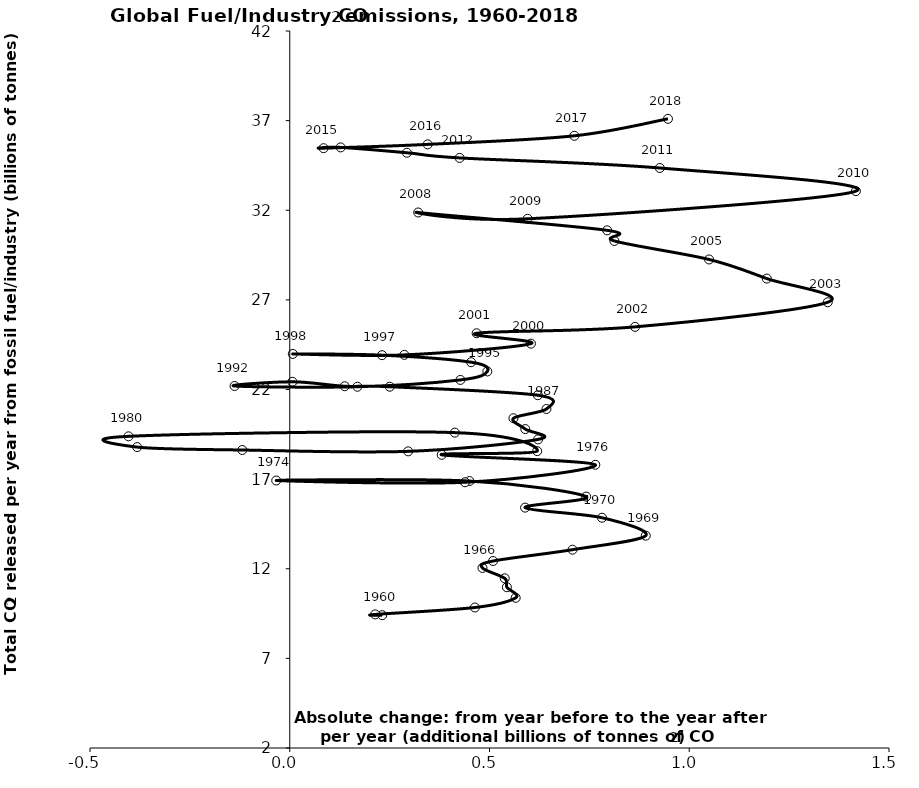
| Category | Series 0 |
|---|---|
| 0.23146562407475813 | 9.411 |
| 0.21383615006685286 | 9.452 |
| 0.4634801109361941 | 9.838 |
| 0.5655615440926338 | 10.379 |
| 0.5435411324445001 | 10.969 |
| 0.5381153633824161 | 11.466 |
| 0.4824295769018647 | 12.046 |
| 0.5089468870351821 | 12.431 |
| 0.7077089795500786 | 13.063 |
| 0.8911826705099957 | 13.846 |
| 0.7816451085866474 | 14.846 |
| 0.5890878956009589 | 15.41 |
| 0.7418219386721985 | 16.024 |
| 0.44979396820509443 | 16.893 |
| -0.03386023817242467 | 16.924 |
| 0.4386968525194508 | 16.826 |
| 0.7648991361638409 | 17.801 |
| 0.3803632184840193 | 18.355 |
| 0.6193947906110164 | 18.562 |
| 0.4131977566094758 | 19.594 |
| -0.40355309429174824 | 19.388 |
| -0.38200933694357 | 18.787 |
| -0.11883728997896092 | 18.624 |
| 0.2963951774889946 | 18.549 |
| 0.6215869022801161 | 19.217 |
| 0.5895417434910399 | 19.793 |
| 0.5598958242994492 | 20.396 |
| 0.6425798941152472 | 20.912 |
| 0.6209611192887365 | 21.681 |
| 0.2503490225381739 | 22.154 |
| 0.13752084812588983 | 22.182 |
| 0.006648881727979727 | 22.429 |
| -0.1381171591243433 | 22.195 |
| 0.16936391930284245 | 22.153 |
| 0.4271411345097462 | 22.534 |
| 0.4945730686849785 | 23.007 |
| 0.4539520134312962 | 23.523 |
| 0.2310023945763291 | 23.915 |
| 0.007616032238956905 | 23.985 |
| 0.2868535939047874 | 23.931 |
| 0.6037191098331807 | 24.559 |
| 0.4677497357353477 | 25.138 |
| 0.8643693463892994 | 25.494 |
| 1.3467041901631216 | 26.867 |
| 1.194083985076741 | 28.188 |
| 1.049618725174529 | 29.255 |
| 0.812619472600117 | 30.287 |
| 0.7944597055774807 | 30.88 |
| 0.3214988387825315 | 31.876 |
| 0.5954477077799183 | 31.523 |
| 1.4171114733197463 | 33.067 |
| 0.9263187487117541 | 34.357 |
| 0.4252600291495021 | 34.919 |
| 0.2932691648079171 | 35.208 |
| 0.12743037906869503 | 35.506 |
| 0.08463619997553806 | 35.463 |
| 0.34525745428086907 | 35.675 |
| 0.7124502803526767 | 36.153 |
| 0.9467383548915294 | 37.1 |